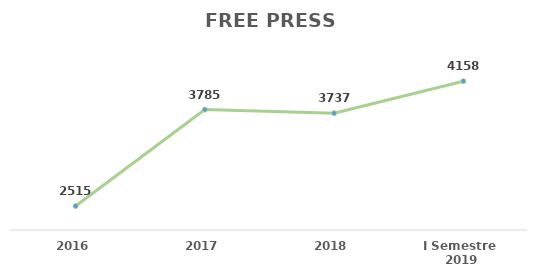
| Category | Series 0 |
|---|---|
| 2016 | 2515 |
| 2017 | 3785 |
| 2018 | 3737 |
| I Semestre 
2019 | 4158 |